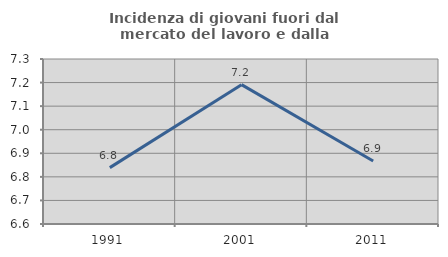
| Category | Incidenza di giovani fuori dal mercato del lavoro e dalla formazione  |
|---|---|
| 1991.0 | 6.839 |
| 2001.0 | 7.191 |
| 2011.0 | 6.867 |